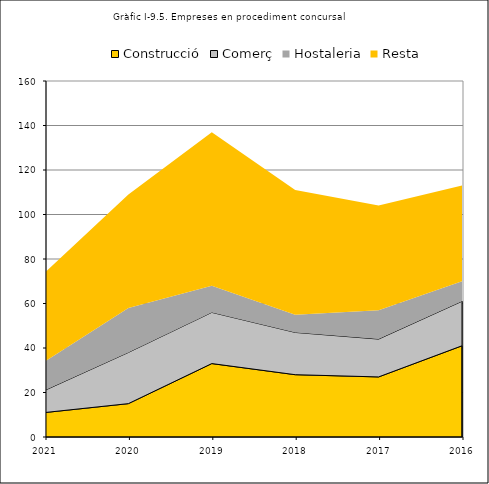
| Category | Construcció | Comerç | Hostaleria | Resta |
|---|---|---|---|---|
| 2016.0 | 41 | 20 | 9 | 43 |
| 2017.0 | 27 | 17 | 13 | 47 |
| 2018.0 | 28 | 19 | 8 | 56 |
| 2019.0 | 33 | 23 | 12 | 69 |
| 2020.0 | 15 | 23 | 20 | 51 |
| 2021.0 | 11 | 10 | 13 | 40 |